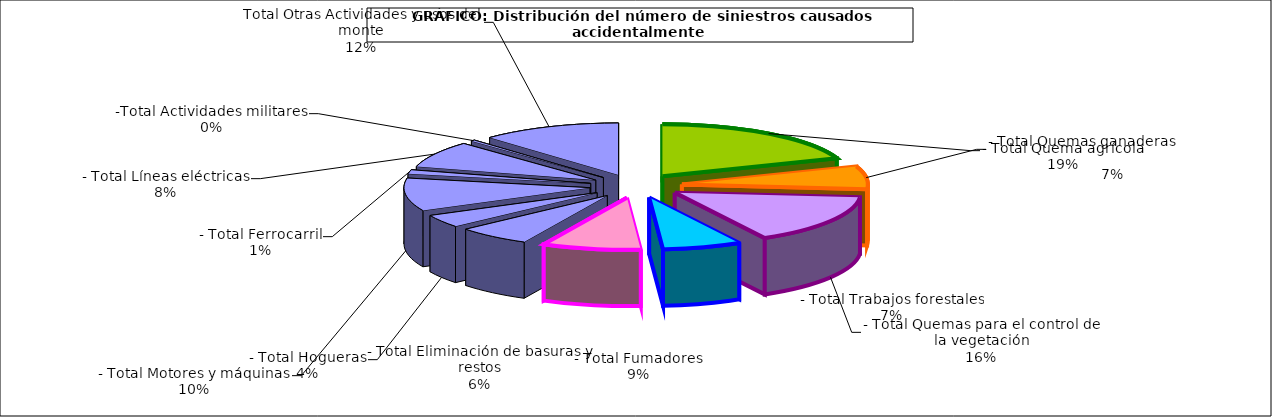
| Category | Series 0 |
|---|---|
| - Total Quema agrícola | 587 |
| - Total Quemas ganaderas                 | 215 |
| - Total Quemas para el control de la vegetación | 471 |
| - Total Trabajos forestales | 208 |
| - Total Fumadores | 260 |
| - Total Eliminación de basuras y restos | 194 |
| - Total Hogueras | 121 |
| - Total Motores y máquinas | 310 |
| - Total Ferrocarril | 38 |
| - Total Líneas eléctricas | 249 |
| -Total Actividades militares | 11 |
|  Total Otras Actividades y usos del monte | 370 |